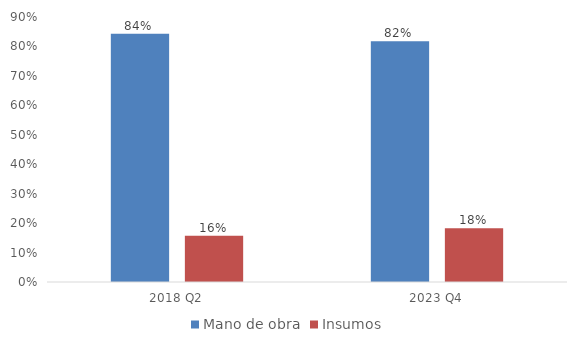
| Category | Mano de obra | Insumos |
|---|---|---|
| 2018 Q2 | 0.843 | 0.157 |
| 2023 Q4 | 0.817 | 0.183 |